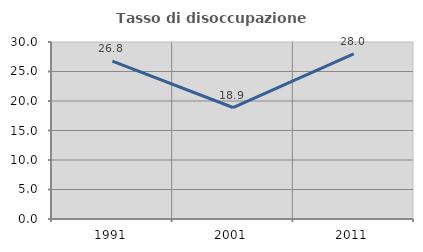
| Category | Tasso di disoccupazione giovanile  |
|---|---|
| 1991.0 | 26.764 |
| 2001.0 | 18.896 |
| 2011.0 | 28.003 |